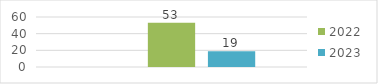
| Category | Abril - Junio | 2022 | 2023 |
|---|---|---|---|
| 0 |  | 53 | 19 |